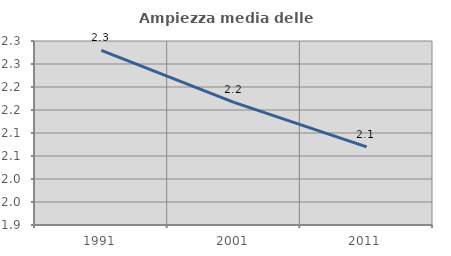
| Category | Ampiezza media delle famiglie |
|---|---|
| 1991.0 | 2.28 |
| 2001.0 | 2.167 |
| 2011.0 | 2.07 |